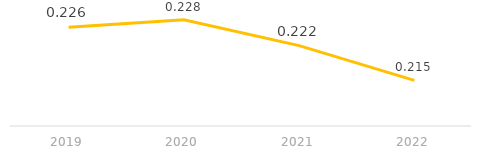
| Category | Relación entre el consumo de suelo y el crecimiento de la población  |
|---|---|
| 2019.0 | 0.226 |
| 2020.0 | 0.228 |
| 2021.0 | 0.222 |
| 2022.0 | 0.215 |